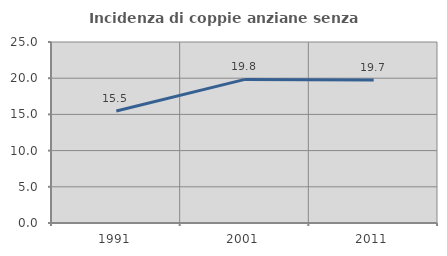
| Category | Incidenza di coppie anziane senza figli  |
|---|---|
| 1991.0 | 15.466 |
| 2001.0 | 19.837 |
| 2011.0 | 19.741 |